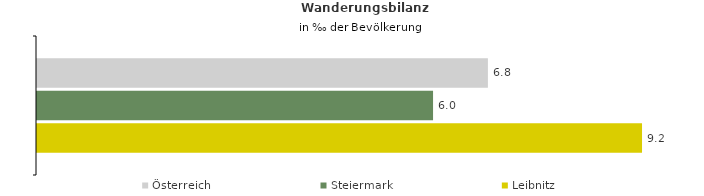
| Category | Österreich | Steiermark | Leibnitz |
|---|---|---|---|
| Wanderungsrate in ‰ der Bevölkerung, Periode 2018-2022 | 6.822 | 5.992 | 9.153 |